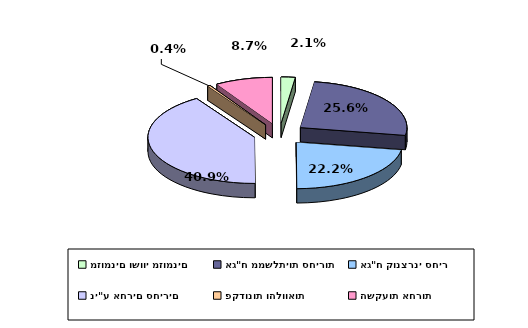
| Category | Series 0 |
|---|---|
| מזומנים ושווי מזומנים | 0.021 |
| אג"ח ממשלתיות סחירות | 0.256 |
| אג"ח קונצרני סחיר | 0.222 |
| ני"ע אחרים סחירים | 0.409 |
| פקדונות והלוואות | 0.004 |
| השקעות אחרות | 0.087 |